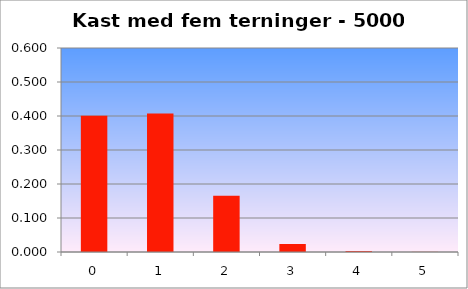
| Category | Rel. frek. |
|---|---|
| 0.0 | 0.401 |
| 1.0 | 0.408 |
| 2.0 | 0.165 |
| 3.0 | 0.024 |
| 4.0 | 0.003 |
| 5.0 | 0 |